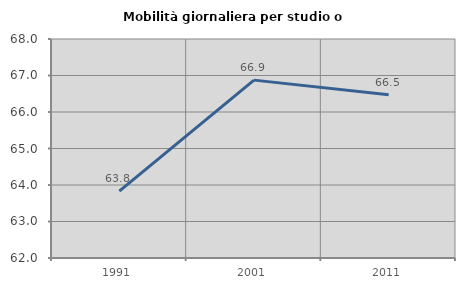
| Category | Mobilità giornaliera per studio o lavoro |
|---|---|
| 1991.0 | 63.832 |
| 2001.0 | 66.873 |
| 2011.0 | 66.476 |